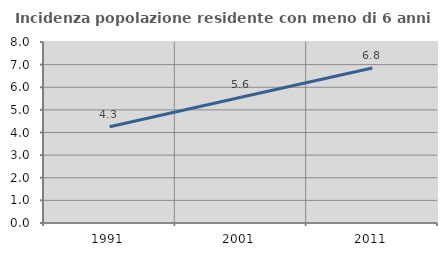
| Category | Incidenza popolazione residente con meno di 6 anni |
|---|---|
| 1991.0 | 4.255 |
| 2001.0 | 5.556 |
| 2011.0 | 6.849 |